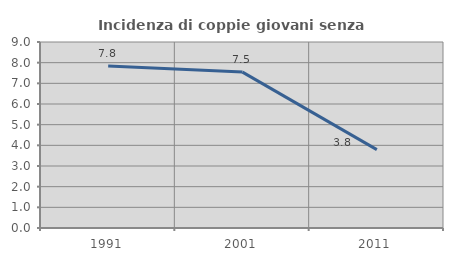
| Category | Incidenza di coppie giovani senza figli |
|---|---|
| 1991.0 | 7.843 |
| 2001.0 | 7.543 |
| 2011.0 | 3.792 |